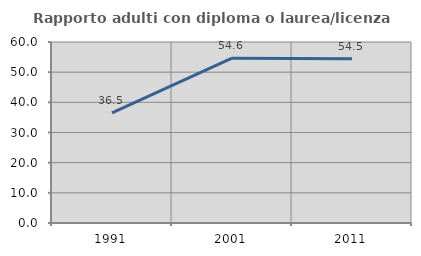
| Category | Rapporto adulti con diploma o laurea/licenza media  |
|---|---|
| 1991.0 | 36.486 |
| 2001.0 | 54.639 |
| 2011.0 | 54.464 |